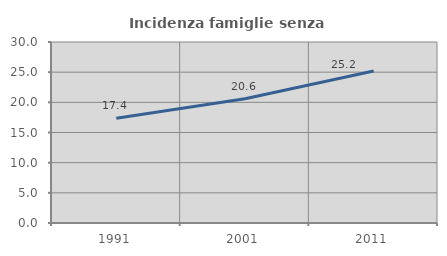
| Category | Incidenza famiglie senza nuclei |
|---|---|
| 1991.0 | 17.356 |
| 2001.0 | 20.6 |
| 2011.0 | 25.187 |